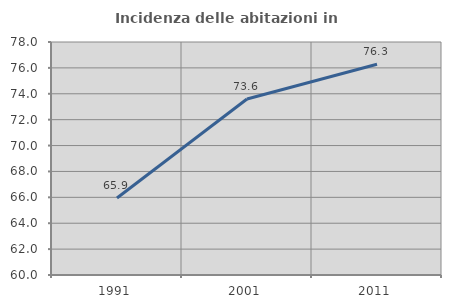
| Category | Incidenza delle abitazioni in proprietà  |
|---|---|
| 1991.0 | 65.949 |
| 2001.0 | 73.596 |
| 2011.0 | 76.283 |